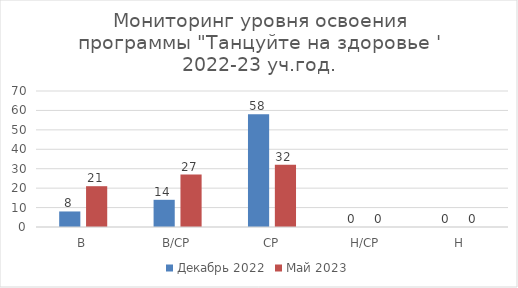
| Category | Декабрь 2022 | Май 2023 |
|---|---|---|
| В | 8 | 21 |
| В/СР | 14 | 27 |
| СР | 58 | 32 |
| Н/СР | 0 | 0 |
| Н | 0 | 0 |